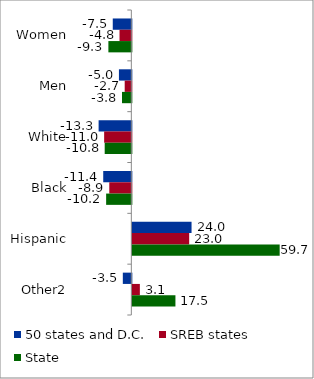
| Category | 50 states and D.C. | SREB states | State |
|---|---|---|---|
| Women | -7.531 | -4.792 | -9.304 |
| Men | -5.029 | -2.69 | -3.793 |
| White | -13.266 | -11.025 | -10.798 |
| Black | -11.397 | -8.938 | -10.214 |
| Hispanic | 24.008 | 23.049 | 59.732 |
| Other2 | -3.453 | 3.052 | 17.472 |